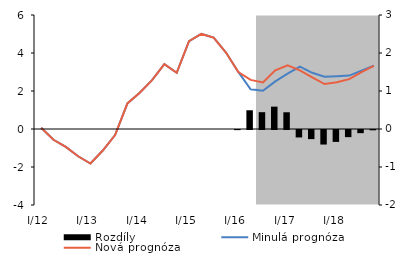
| Category | Rozdíly |
|---|---|
| I/12 | 0 |
| II | 0 |
| III | 0 |
| IV | 0 |
| I/13 | 0 |
| II | 0 |
| III | 0 |
| IV | 0 |
| I/14 | 0 |
| II | 0 |
| III | 0 |
| IV | 0 |
| I/15 | 0 |
| II | 0 |
| III | 0 |
| IV | 0 |
| I/16 | -0.004 |
| II | 0.493 |
| III | 0.443 |
| IV | 0.588 |
| I/17 | 0.44 |
| II | -0.196 |
| III | -0.24 |
| IV | -0.383 |
| I/18 | -0.313 |
| II | -0.188 |
| III | -0.083 |
| IV | -0.008 |